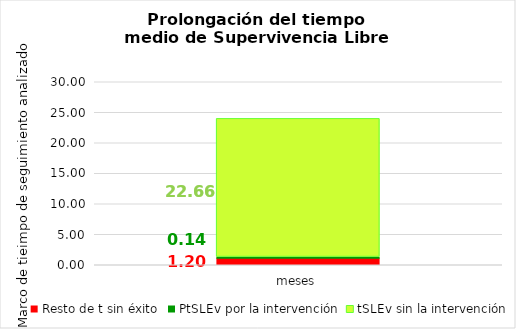
| Category | Resto de t sin éxito | PtSLEv por la intervención | tSLEv sin la intervención |
|---|---|---|---|
| meses | 1.2 | 0.144 | 22.656 |